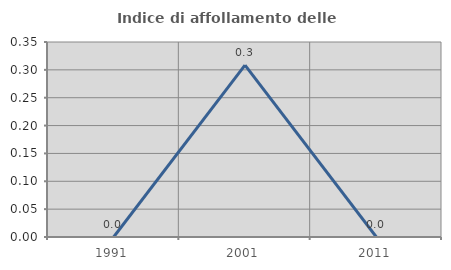
| Category | Indice di affollamento delle abitazioni  |
|---|---|
| 1991.0 | 0 |
| 2001.0 | 0.309 |
| 2011.0 | 0 |